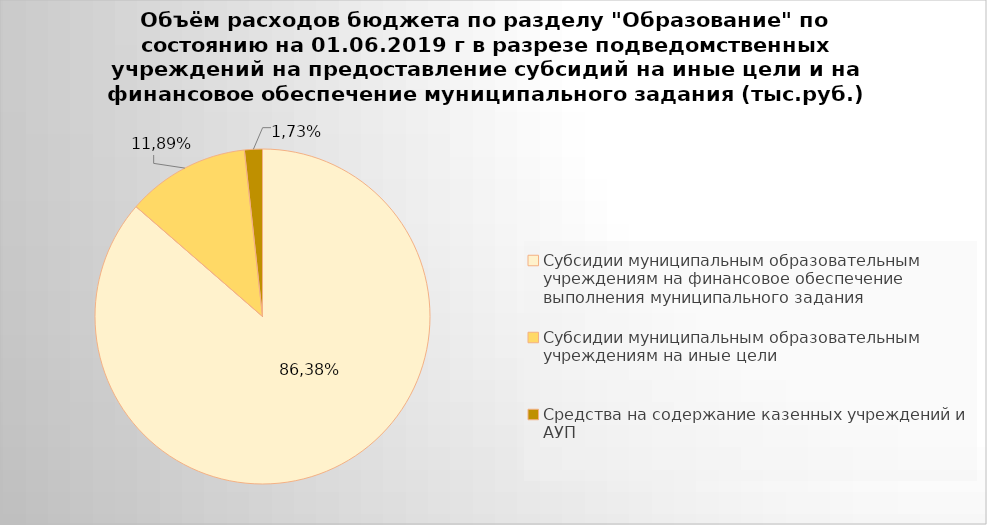
| Category | Series 0 |
|---|---|
| Субсидии муниципальным образовательным учреждениям на финансовое обеспечение выполнения муниципального задания | 4465537.375 |
| Субсидии муниципальным образовательным учреждениям на иные цели | 614698.369 |
| Средства на содержание казенных учреждений и АУП | 89369.9 |